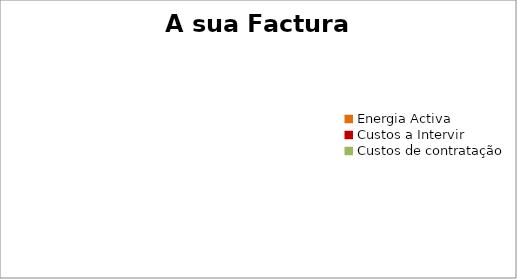
| Category | Total |
|---|---|
| Energia Activa | 0 |
| Custos a Intervir | 0 |
| Custos de contratação | 0 |